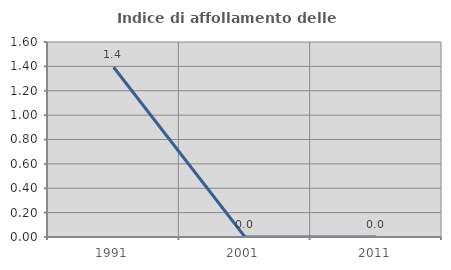
| Category | Indice di affollamento delle abitazioni  |
|---|---|
| 1991.0 | 1.393 |
| 2001.0 | 0 |
| 2011.0 | 0 |